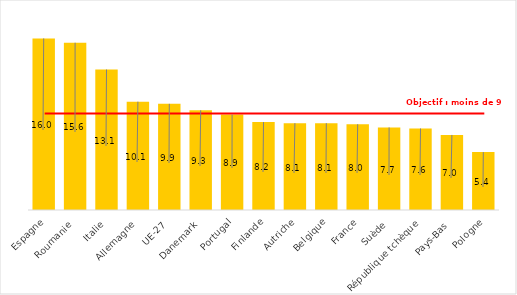
| Category | 2020 |
|---|---|
| Espagne | 16 |
| Roumanie | 15.6 |
| Italie | 13.1 |
| Allemagne | 10.1 |
| UE-27 | 9.9 |
| Danemark | 9.3 |
| Portugal | 8.9 |
| Finlande | 8.2 |
| Autriche | 8.1 |
| Belgique | 8.1 |
| France | 8 |
| Suède | 7.7 |
| République tchèque | 7.6 |
| Pays-Bas | 7 |
| Pologne | 5.4 |